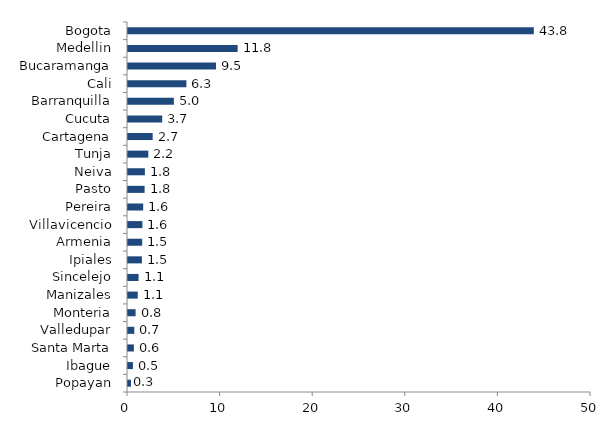
| Category | Series 0 |
|---|---|
| Popayan | 0.317 |
| Ibague | 0.534 |
| Santa Marta | 0.637 |
| Valledupar | 0.681 |
| Monteria | 0.82 |
| Manizales | 1.053 |
| Sincelejo | 1.141 |
| Ipiales | 1.502 |
| Armenia | 1.532 |
| Villavicencio | 1.556 |
| Pereira | 1.641 |
| Pasto | 1.793 |
| Neiva | 1.821 |
| Tunja | 2.194 |
| Cartagena | 2.664 |
| Cucuta | 3.693 |
| Barranquilla | 4.952 |
| Cali | 6.303 |
| Bucaramanga | 9.503 |
| Medellin | 11.84 |
| Bogota | 43.822 |